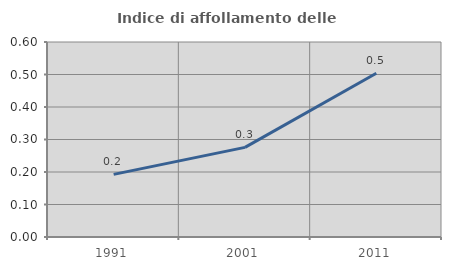
| Category | Indice di affollamento delle abitazioni  |
|---|---|
| 1991.0 | 0.193 |
| 2001.0 | 0.276 |
| 2011.0 | 0.504 |